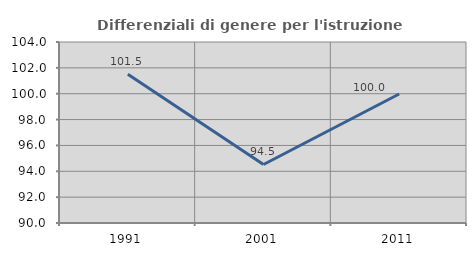
| Category | Differenziali di genere per l'istruzione superiore |
|---|---|
| 1991.0 | 101.514 |
| 2001.0 | 94.526 |
| 2011.0 | 99.975 |